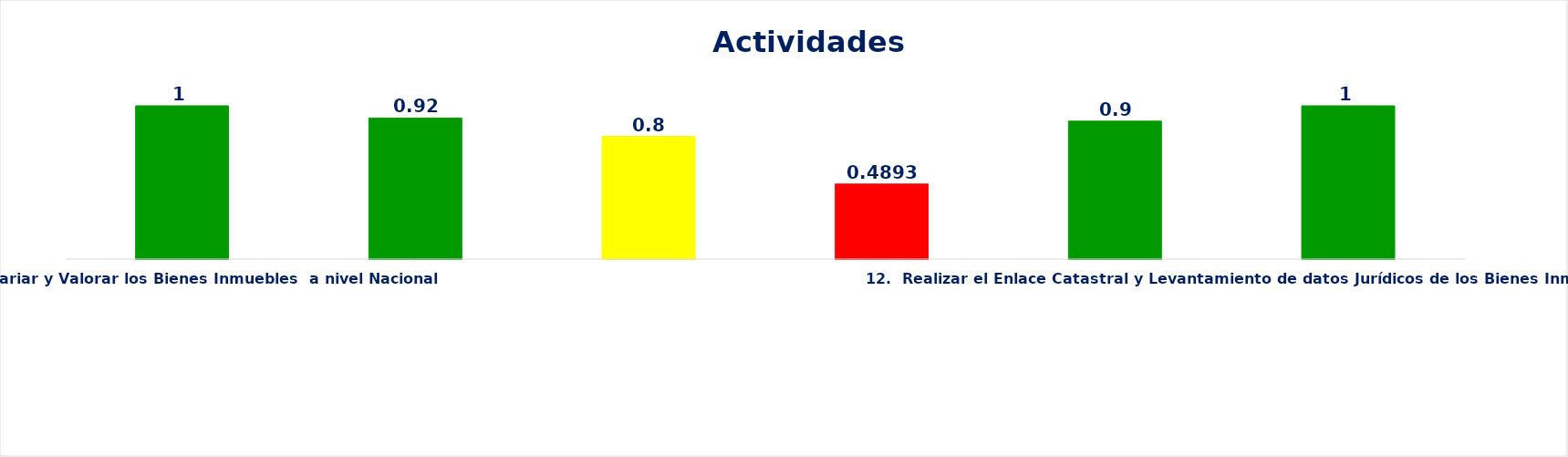
| Category | Series 0 |
|---|---|
| 7.  Inventariar y Valorar los Bienes Inmuebles  a nivel Nacional | 1 |
| 8. Ciudadanos reciben servicios de:                                                         • Expedición de Certificado de Avalúos                                                   • Certificación de No Inscripción de Inmuebles                             | 0.92 |
| 9. Elaborar y actualizar los Estudios de Mercado Locales (Índices de Precios):  
•La Vega
• Espaillat | 0.8 |
| 10. Digitalizar Expedientes físicos de los Servicios que ofrece la Institución. | 0.489 |
| 11.  Elaborar un Plan de Mejora de los Productos Cartográficos Catastrales.
 | 0.9 |
| 12.  Realizar el Enlace Catastral y Levantamiento de datos Jurídicos de los Bienes Inmuebles  en el Distrito Nacional  | 1 |